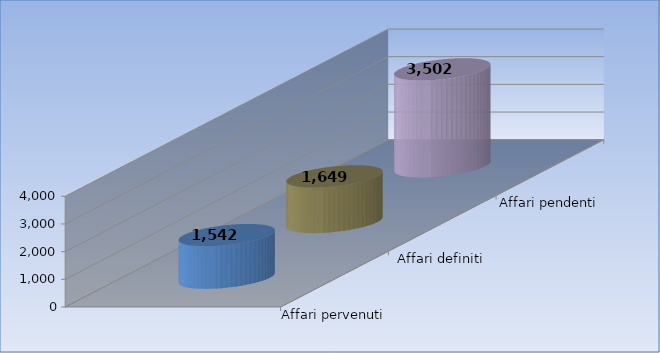
| Category | Affari pervenuti | Affari definiti | Affari pendenti |
|---|---|---|---|
| 0 | 1542 | 1649 | 3502 |